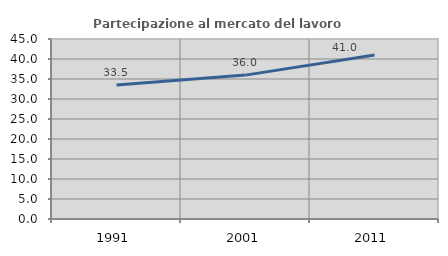
| Category | Partecipazione al mercato del lavoro  femminile |
|---|---|
| 1991.0 | 33.528 |
| 2001.0 | 35.971 |
| 2011.0 | 41.008 |